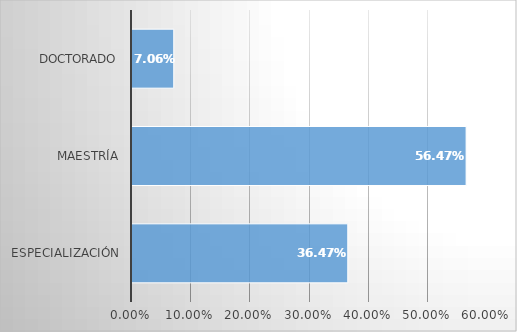
| Category | Series 0 |
|---|---|
| Especialización | 0.365 |
| Maestría | 0.565 |
| Doctorado | 0.071 |